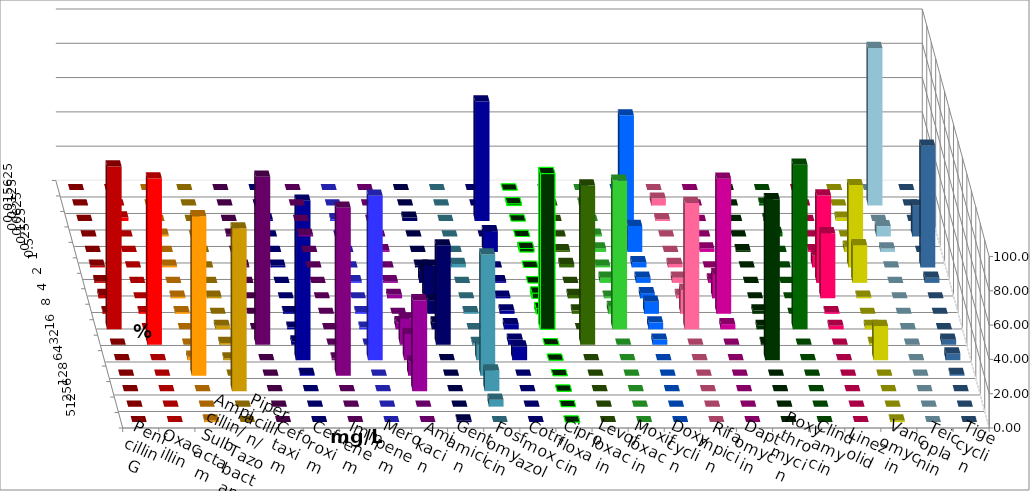
| Category | Penicillin G | Oxacillin | Ampicillin/ Sulbactam | Piperacillin/ Tazobactam | Cefotaxim | Cefuroxim | Imipenem | Meropenem | Amikacin | Gentamicin | Fosfomycin | Cotrimoxazol | Ciprofloxacin | Levofloxacin | Moxifloxacin | Doxycyclin | Rifampicin | Daptomycin | Roxythromycin | Clindamycin | Linezolid | Vancomycin | Teicoplanin | Tigecyclin |
|---|---|---|---|---|---|---|---|---|---|---|---|---|---|---|---|---|---|---|---|---|---|---|---|---|
| 0.015625 | 0 | 0 | 0 | 0 | 0 | 0 | 0 | 0 | 0 | 0 | 0 | 0 | 0 | 0 | 0 | 0 | 0 | 0 | 0 | 0 | 0 | 0 | 0 | 0 |
| 0.03125 | 0 | 0 | 0 | 0 | 0 | 0 | 0 | 0 | 0 | 0 | 0 | 0 | 1.02 | 0 | 1.02 | 0 | 4.04 | 0 | 0 | 1.01 | 0 | 0 | 0 | 91.919 |
| 0.0625 | 0 | 2.02 | 0 | 0 | 0 | 0 | 1 | 1.01 | 0 | 2 | 0 | 69.697 | 0 | 0 | 0 | 61.616 | 1.01 | 0 | 0 | 1.01 | 0 | 2 | 0 | 0 |
| 0.125 | 0 | 0 | 1 | 0 | 1.01 | 1.01 | 0 | 0 | 0 | 0 | 0 | 0 | 0 | 0 | 1.02 | 0 | 0 | 0 | 0 | 2.02 | 0 | 0 | 18 | 6.061 |
| 0.25 | 0 | 0 | 0 | 0 | 0 | 0 | 0 | 0 | 1.02 | 0 | 0 | 12.121 | 2.041 | 1.01 | 2.041 | 15.152 | 0 | 2.02 | 1.01 | 0 | 1 | 3 | 0 | 2.02 |
| 0.5 | 1.01 | 0 | 1 | 0 | 1.01 | 0 | 1 | 0 | 0 | 1 | 2.02 | 0 | 0 | 2.02 | 1.02 | 3.03 | 2.02 | 0 | 0 | 0 | 7 | 48 | 71 | 0 |
| 1.0 | 1.01 | 0 | 0 | 0 | 0 | 0 | 0 | 1.01 | 1.02 | 7 | 0 | 1.01 | 0 | 0 | 3.061 | 3.03 | 3.03 | 2.02 | 0 | 0 | 51 | 22 | 3 | 0 |
| 2.0 | 2.02 | 0 | 1 | 1.01 | 0 | 0 | 0 | 0 | 2.041 | 19 | 0 | 1.01 | 3.061 | 2.02 | 1.02 | 3.03 | 2.02 | 14.141 | 0 | 0 | 38 | 1 | 0 | 0 |
| 4.0 | 1.01 | 1.01 | 1 | 0 | 0 | 0 | 1 | 1.01 | 0 | 8 | 1.01 | 2.02 | 3.061 | 2.02 | 4.082 | 7.071 | 14.141 | 78.788 | 2.02 | 0 | 1 | 0 | 0 | 0 |
| 8.0 | 94.949 | 0 | 0 | 2.02 | 0 | 0 | 1 | 1.01 | 4.082 | 4 | 0 | 3.03 | 90.816 | 0 | 86.735 | 4.04 | 73.737 | 3.03 | 2.02 | 95.96 | 2 | 2 | 0 | 0 |
| 16.0 | 0 | 96.97 | 0 | 1.01 | 97.98 | 0 | 2 | 0 | 15.306 | 58 | 1.01 | 3.03 | 0 | 92.929 | 0 | 3.03 | 0 | 0 | 1.01 | 0 | 0 | 1 | 3 | 0 |
| 32.0 | 0 | 0 | 2 | 1.01 | 0 | 1.01 | 93 | 95.96 | 15.306 | 0 | 9.091 | 8.081 | 0 | 0 | 0 | 0 | 0 | 0 | 93.939 | 0 | 0 | 20 | 4 | 0 |
| 64.0 | 0 | 0 | 93 | 0 | 0 | 97.98 | 1 | 0 | 8.163 | 0 | 70.707 | 0 | 0 | 0 | 0 | 0 | 0 | 0 | 0 | 0 | 0 | 0 | 1 | 0 |
| 128.0 | 0 | 0 | 0 | 94.949 | 0 | 0 | 0 | 0 | 53.061 | 0 | 12.121 | 0 | 0 | 0 | 0 | 0 | 0 | 0 | 0 | 0 | 0 | 0 | 0 | 0 |
| 256.0 | 0 | 0 | 0 | 0 | 0 | 0 | 0 | 0 | 0 | 0 | 4.04 | 0 | 0 | 0 | 0 | 0 | 0 | 0 | 0 | 0 | 0 | 0 | 0 | 0 |
| 512.0 | 0 | 0 | 1 | 0 | 0 | 0 | 0 | 0 | 0 | 1 | 0 | 0 | 0 | 0 | 0 | 0 | 0 | 0 | 0 | 0 | 0 | 1 | 0 | 0 |